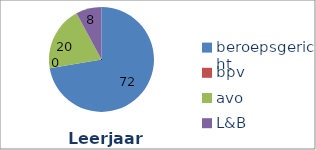
| Category | Series 1 | Series 0 |
|---|---|---|
| beroepsgericht | 72.311 | 72.311 |
| bpv | 0 | 0 |
| avo | 19.778 | 19.778 |
| L&B | 7.911 | 7.911 |